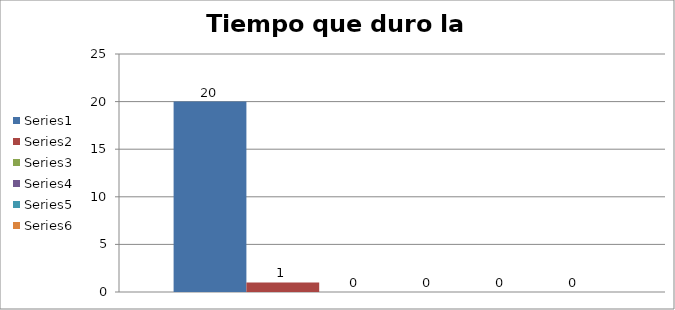
| Category | Series 0 | Series 1 | Series 2 | Series 3 | Series 4 | Series 5 |
|---|---|---|---|---|---|---|
| 0 | 20 | 1 | 0 | 0 | 0 | 0 |